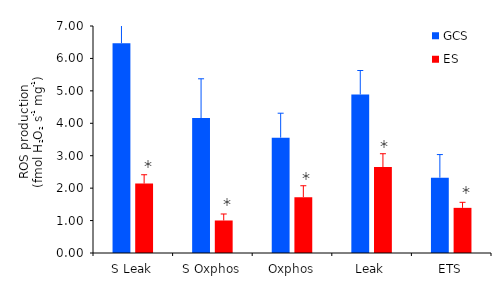
| Category | GCS | ES |
|---|---|---|
| S Leak | 6.47 | 2.14 |
| S Oxphos | 4.161 | 1.003 |
| Oxphos | 3.558 | 1.722 |
| Leak | 4.888 | 2.65 |
| ETS | 2.323 | 1.392 |